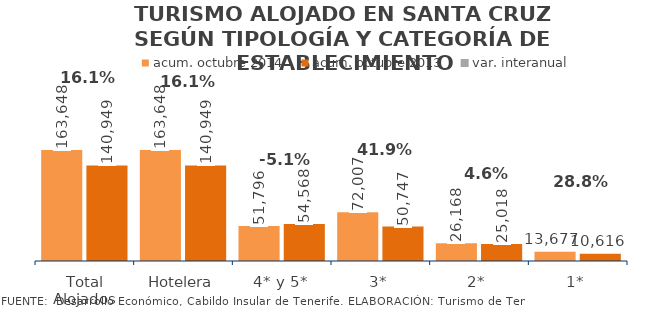
| Category | acum. octubre 2014 | acum. octubre 2013 |
|---|---|---|
| Total Alojados | 163648 | 140949 |
| Hotelera | 163648 | 140949 |
| 4* y 5* | 51796 | 54568 |
| 3* | 72007 | 50747 |
| 2* | 26168 | 25018 |
| 1* | 13677 | 10616 |